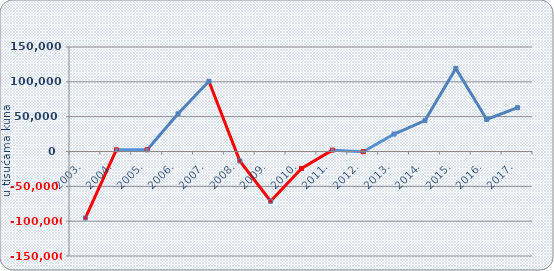
| Category | Neto dobit/gubitak |
|---|---|
| 2003. | -95344.036 |
| 2004. | 2436.128 |
| 2005. | 2570.111 |
| 2006. | 54067.607 |
| 2007. | 100801.461 |
| 2008. | -13516.351 |
| 2009. | -71435.126 |
| 2010. | -24239.572 |
| 2011. | 1954.712 |
| 2012. | -299.182 |
| 2013. | 25029.006 |
| 2014. | 44359.392 |
| 2015. | 119271.921 |
| 2016. | 46028.074 |
| 2017. | 62930.867 |